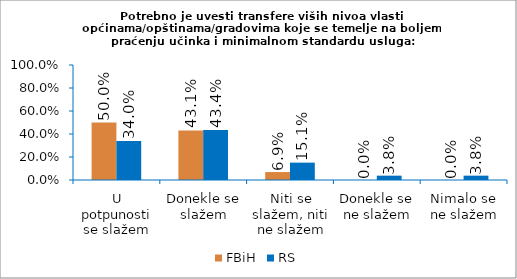
| Category | FBiH | RS |
|---|---|---|
| U potpunosti se slažem | 0.5 | 0.34 |
| Donekle se slažem | 0.431 | 0.434 |
| Niti se slažem, niti ne slažem | 0.069 | 0.151 |
| Donekle se ne slažem | 0 | 0.038 |
| Nimalo se ne slažem | 0 | 0.038 |